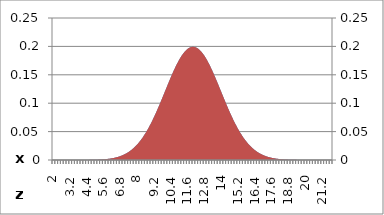
| Category | Height |
|---|---|
| 2.0 | 0 |
| 2.1999999999999993 | 0 |
| 2.3999999999999986 | 0 |
| 2.599999999999998 | 0 |
| 2.799999999999997 | 0 |
| 2.9999999999999964 | 0 |
| 3.1999999999999957 | 0 |
| 3.399999999999995 | 0 |
| 3.5999999999999943 | 0 |
| 3.7999999999999936 | 0 |
| 3.999999999999993 | 0 |
| 4.199999999999993 | 0 |
| 4.399999999999993 | 0 |
| 4.599999999999993 | 0 |
| 4.799999999999994 | 0 |
| 4.999999999999994 | 0 |
| 5.199999999999994 | 0.001 |
| 5.399999999999994 | 0.001 |
| 5.599999999999994 | 0.001 |
| 5.7999999999999945 | 0.002 |
| 5.999999999999995 | 0.002 |
| 6.199999999999995 | 0.003 |
| 6.399999999999995 | 0.004 |
| 6.599999999999995 | 0.005 |
| 6.799999999999995 | 0.007 |
| 6.999999999999996 | 0.009 |
| 7.199999999999996 | 0.011 |
| 7.399999999999996 | 0.014 |
| 7.599999999999996 | 0.018 |
| 7.799999999999996 | 0.022 |
| 7.9999999999999964 | 0.027 |
| 8.199999999999996 | 0.033 |
| 8.399999999999997 | 0.039 |
| 8.599999999999998 | 0.047 |
| 8.799999999999997 | 0.055 |
| 8.999999999999996 | 0.065 |
| 9.199999999999998 | 0.075 |
| 9.399999999999999 | 0.086 |
| 9.599999999999998 | 0.097 |
| 9.799999999999997 | 0.109 |
| 9.999999999999998 | 0.121 |
| 10.199999999999998 | 0.133 |
| 10.399999999999999 | 0.145 |
| 10.599999999999998 | 0.156 |
| 10.799999999999997 | 0.167 |
| 10.999999999999998 | 0.176 |
| 11.199999999999998 | 0.184 |
| 11.399999999999999 | 0.191 |
| 11.599999999999998 | 0.196 |
| 11.799999999999997 | 0.198 |
| 12.0 | 0.199 |
| 12.2 | 0.198 |
| 12.4 | 0.196 |
| 12.6 | 0.191 |
| 12.8 | 0.184 |
| 13.0 | 0.176 |
| 13.2 | 0.167 |
| 13.4 | 0.156 |
| 13.6 | 0.145 |
| 13.8 | 0.133 |
| 14.0 | 0.121 |
| 14.2 | 0.109 |
| 14.4 | 0.097 |
| 14.6 | 0.086 |
| 14.8 | 0.075 |
| 15.0 | 0.065 |
| 15.200000000000001 | 0.055 |
| 15.4 | 0.047 |
| 15.600000000000001 | 0.039 |
| 15.8 | 0.033 |
| 16.0 | 0.027 |
| 16.200000000000003 | 0.022 |
| 16.400000000000002 | 0.018 |
| 16.6 | 0.014 |
| 16.8 | 0.011 |
| 17.0 | 0.009 |
| 17.200000000000003 | 0.007 |
| 17.400000000000002 | 0.005 |
| 17.6 | 0.004 |
| 17.800000000000004 | 0.003 |
| 18.000000000000004 | 0.002 |
| 18.200000000000003 | 0.002 |
| 18.400000000000002 | 0.001 |
| 18.6 | 0.001 |
| 18.800000000000004 | 0.001 |
| 19.000000000000004 | 0 |
| 19.200000000000003 | 0 |
| 19.400000000000006 | 0 |
| 19.600000000000005 | 0 |
| 19.800000000000004 | 0 |
| 20.000000000000004 | 0 |
| 20.200000000000003 | 0 |
| 20.400000000000002 | 0 |
| 20.6 | 0 |
| 20.8 | 0 |
| 21.0 | 0 |
| 21.2 | 0 |
| 21.4 | 0 |
| 21.599999999999998 | 0 |
| 21.799999999999997 | 0 |
| 21.999999999999996 | 0 |